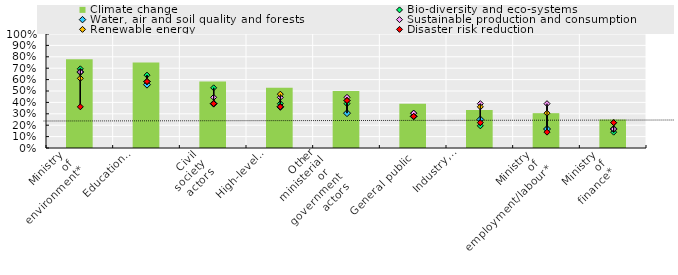
| Category | Climate change |
|---|---|
| Ministry
 of
 environment* | 0.778 |
| Education
sector
actors | 0.75 |
| Civil
society
actors | 0.583 |
| High-level
political
leadership | 0.528 |
| Other
ministerial
or 
government
actors | 0.5 |
| General public | 0.389 |
| Industry,
business
and
employers | 0.333 |
| Ministry
of
employment/labour* | 0.306 |
| Ministry
of
finance* | 0.25 |